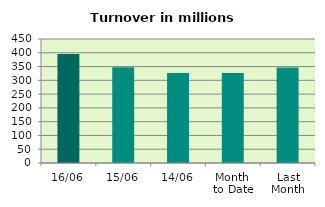
| Category | Series 0 |
|---|---|
| 16/06 | 395.523 |
| 15/06 | 347.394 |
| 14/06 | 326.818 |
| Month 
to Date | 326.661 |
| Last
Month | 346.329 |